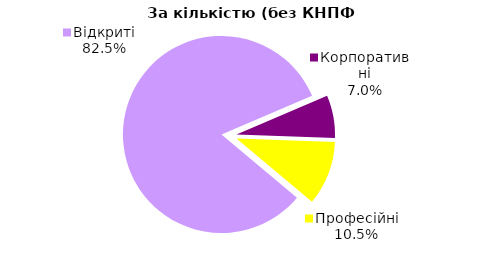
| Category | Series 0 |
|---|---|
| Відкриті | 47 |
| Корпоративні | 4 |
| Професійні | 6 |